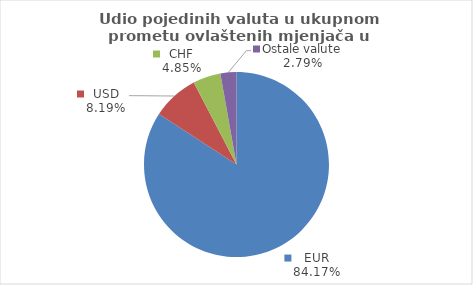
| Category | Series 0 |
|---|---|
| EUR | 84.171 |
| USD | 8.187 |
| CHF | 4.848 |
| Ostale valute | 2.794 |